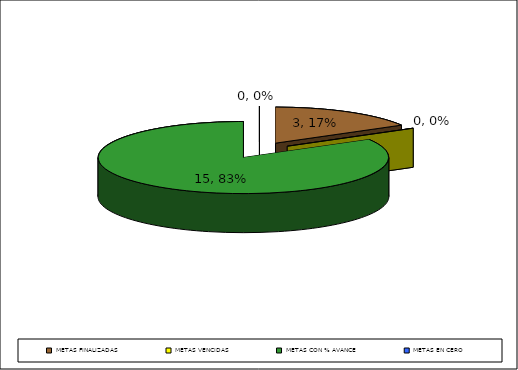
| Category | Series 0 | Series 1 |
|---|---|---|
| METAS FINALIZADAS | 3 |  |
| METAS VENCIDAS | 0 |  |
| METAS CON % AVANCE | 15 |  |
| METAS EN CERO | 0 |  |